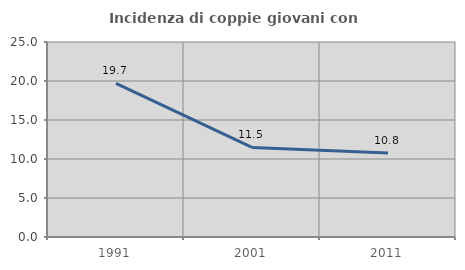
| Category | Incidenza di coppie giovani con figli |
|---|---|
| 1991.0 | 19.706 |
| 2001.0 | 11.481 |
| 2011.0 | 10.781 |